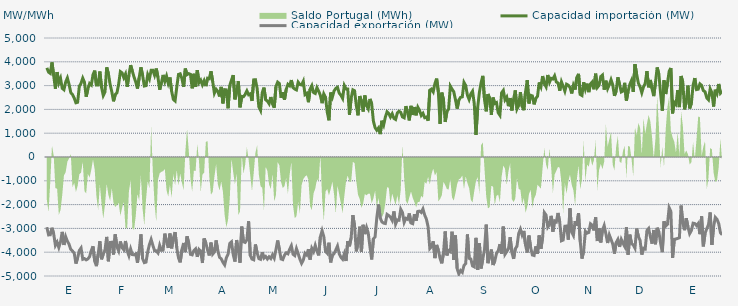
| Category | Capacidad importación (MW) | Capacidad exportación (MW) |
|---|---|---|
| 0 | 3746.25 | -2948.958 |
| 1900-01-01 | 3564.375 | -3273.75 |
| 1900-01-02 | 3513.75 | -3266.25 |
| 1900-01-03 | 3975 | -2973.75 |
| 1900-01-04 | 3418.125 | -3228.75 |
| 1900-01-05 | 2868.75 | -3712.5 |
| 1900-01-06 | 3568.125 | -3577.5 |
| 1900-01-07 | 3120 | -3802.5 |
| 1900-01-08 | 3305.625 | -3564.375 |
| 1900-01-09 | 2884.375 | -3145.875 |
| 1900-01-10 | 2826.25 | -3695.625 |
| 1900-01-11 | 3149.792 | -3346.875 |
| 1900-01-12 | 3321.458 | -3540 |
| 1900-01-13 | 3048.75 | -3665.625 |
| 1900-01-14 | 2704.25 | -3881.25 |
| 1900-01-15 | 2627.25 | -3950.625 |
| 1900-01-16 | 2475.708 | -4038.75 |
| 1900-01-17 | 2277.917 | -4477.5 |
| 1900-01-18 | 2300 | -4239.375 |
| 1900-01-19 | 2972.708 | -3928.125 |
| 1900-01-20 | 3093.75 | -3825 |
| 1900-01-21 | 3313.333 | -4297.5 |
| 1900-01-22 | 3141.75 | -4268.125 |
| 1900-01-23 | 2533.125 | -4321.875 |
| 1900-01-24 | 2863.375 | -4282.5 |
| 1900-01-25 | 3088.125 | -4185 |
| 1900-01-26 | 3024.375 | -3931.875 |
| 1900-01-27 | 3459.375 | -3751.875 |
| 1900-01-28 | 3630 | -4380 |
| 1900-01-29 | 3020.625 | -4586.25 |
| 1900-01-30 | 3020.625 | -4091.25 |
| 1900-01-31 | 3592.5 | -3540 |
| 1900-02-01 | 2925 | -4297.5 |
| 1900-02-02 | 2582.625 | -4080.542 |
| 1900-02-03 | 2730 | -3900.625 |
| 1900-02-04 | 3769.167 | -3357.25 |
| 1900-02-05 | 3498.625 | -4380 |
| 1900-02-06 | 3058.125 | -3591.583 |
| 1900-02-07 | 2735.625 | -3581.875 |
| 1900-02-08 | 2339.792 | -4096.875 |
| 1900-02-09 | 2622.625 | -3250.667 |
| 1900-02-10 | 2697.5 | -3770.625 |
| 1900-02-11 | 3064.167 | -3943.625 |
| 1900-02-12 | 3588.75 | -3549.375 |
| 1900-02-13 | 3535.75 | -3810 |
| 1900-02-14 | 3333.958 | -3898.125 |
| 1900-02-15 | 3486.625 | -3530.542 |
| 1900-02-16 | 2951.375 | -3943.125 |
| 1900-02-17 | 3439.375 | -4149.375 |
| 1900-02-18 | 3860.625 | -3864.375 |
| 1900-02-19 | 3609.583 | -4100.625 |
| 1900-02-20 | 3359.75 | -4110 |
| 1900-02-21 | 3152.25 | -4073.75 |
| 1900-02-22 | 2876.25 | -4441.875 |
| 1900-02-23 | 3331.25 | -3948.75 |
| 1900-02-24 | 3768.75 | -3251.25 |
| 1900-02-25 | 3435.667 | -4269.375 |
| 1900-02-26 | 2984.167 | -4438.125 |
| 1900-02-27 | 2998.583 | -4415.625 |
| 1900-02-28 | 3457.333 | -3980.625 |
| 1900-02-28 | 3283.042 | -3676.875 |
| 1900-03-01 | 3641.25 | -3464.5 |
| 1900-03-02 | 3640.708 | -3708.75 |
| 1900-03-03 | 3435.708 | -3937.5 |
| 1900-03-04 | 3718.125 | -3943.125 |
| 1900-03-05 | 3344.458 | -4031.25 |
| 1900-03-06 | 2827.083 | -3710.625 |
| 1900-03-07 | 3113.75 | -3920.625 |
| 1900-03-08 | 3448.125 | -3913.125 |
| 1900-03-09 | 3172.083 | -3219.375 |
| 1900-03-10 | 3397.5 | -3562.5 |
| 1900-03-11 | 3101.042 | -3819.375 |
| 1900-03-12 | 3341.25 | -3215.625 |
| 1900-03-13 | 2760.833 | -3838.125 |
| 1900-03-14 | 2417.5 | -3395.625 |
| 1900-03-15 | 2354.583 | -3155.625 |
| 1900-03-16 | 2936.875 | -3811.875 |
| 1900-03-17 | 3468.75 | -4241.25 |
| 1900-03-18 | 3495 | -4426.875 |
| 1900-03-19 | 3297.083 | -3890.625 |
| 1900-03-20 | 2946.292 | -3613.125 |
| 1900-03-21 | 3714.792 | -3997.5 |
| 1900-03-22 | 3460.833 | -3331.875 |
| 1900-03-23 | 3502.917 | -3618.5 |
| 1900-03-24 | 3472.5 | -4089.375 |
| 1900-03-25 | 2885.87 | -4111.304 |
| 1900-03-26 | 3496.875 | -3930 |
| 1900-03-27 | 2942.5 | -3858.75 |
| 1900-03-28 | 3650.625 | -4194.375 |
| 1900-03-29 | 3122.458 | -3885 |
| 1900-03-30 | 3230.042 | -3961.875 |
| 1900-03-31 | 3034.208 | -4453.125 |
| 1900-04-01 | 3206.25 | -3423.75 |
| 1900-04-02 | 2977.5 | -3611.25 |
| 1900-04-03 | 3309.375 | -3911.25 |
| 1900-04-04 | 3288.75 | -4138.125 |
| 1900-04-05 | 3602.833 | -3596.25 |
| 1900-04-06 | 3174.375 | -4080 |
| 1900-04-07 | 2683.667 | -3991.875 |
| 1900-04-08 | 2848.875 | -3504.833 |
| 1900-04-09 | 2758.542 | -3938.333 |
| 1900-04-10 | 2545.417 | -4209.375 |
| 1900-04-11 | 2945.625 | -4278.75 |
| 1900-04-12 | 2252.5 | -4423.125 |
| 1900-04-13 | 2829.375 | -4533.75 |
| 1900-04-14 | 2820.917 | -4235.625 |
| 1900-04-15 | 2048.125 | -4081.208 |
| 1900-04-16 | 3003.75 | -3632.292 |
| 1900-04-17 | 3232.5 | -3565.625 |
| 1900-04-18 | 3440.625 | -4096.875 |
| 1900-04-19 | 2422.5 | -4393.125 |
| 1900-04-20 | 2763.958 | -3487.5 |
| 1900-04-21 | 3183.75 | -3943.125 |
| 1900-04-22 | 2087.083 | -4443.75 |
| 1900-04-23 | 2547 | -2925.75 |
| 1900-04-24 | 2531.667 | -3560.625 |
| 1900-04-25 | 2628.75 | -3590.625 |
| 1900-04-26 | 2778.75 | -3480 |
| 1900-04-27 | 2617.292 | -2701.792 |
| 1900-04-28 | 2655 | -4141.875 |
| 1900-04-29 | 2355.417 | -4288.125 |
| 1900-04-30 | 3240.75 | -4318.125 |
| 1900-05-01 | 3247.5 | -3676.875 |
| 1900-05-02 | 2878.042 | -4025.625 |
| 1900-05-03 | 2109.167 | -4269.375 |
| 1900-05-04 | 1961.042 | -4299.375 |
| 1900-05-05 | 2710.208 | -4003.125 |
| 1900-05-06 | 2916 | -4248.333 |
| 1900-05-07 | 2401.875 | -4179.375 |
| 1900-05-08 | 2351.25 | -4286.25 |
| 1900-05-09 | 2238.75 | -4192.5 |
| 1900-05-10 | 2520 | -4265.625 |
| 1900-05-11 | 2227.5 | -4108.125 |
| 1900-05-12 | 2070.583 | -4246.875 |
| 1900-05-13 | 2958.75 | -3892.5 |
| 1900-05-14 | 3146.25 | -3508.125 |
| 1900-05-15 | 3087.5 | -3877.5 |
| 1900-05-16 | 2487.5 | -4284.375 |
| 1900-05-17 | 2722.5 | -4310.625 |
| 1900-05-18 | 2411.25 | -4125 |
| 1900-05-19 | 2840.5 | -4025.625 |
| 1900-05-20 | 3054.5 | -4066.875 |
| 1900-05-21 | 2992.958 | -3879.375 |
| 1900-05-22 | 3232.5 | -3729.375 |
| 1900-05-23 | 2917.5 | -4085.625 |
| 1900-05-24 | 2853.75 | -4141.875 |
| 1900-05-25 | 2819.458 | -3849.375 |
| 1900-05-26 | 3145.042 | -4061.25 |
| 1900-05-27 | 3046.958 | -4290 |
| 1900-05-28 | 3028.125 | -4468.125 |
| 1900-05-29 | 3180.542 | -4331.25 |
| 1900-05-30 | 2624.958 | -4042.5 |
| 1900-05-31 | 2676.25 | -4115.625 |
| 1900-06-01 | 2302.5 | -3873.75 |
| 1900-06-02 | 2854.208 | -4308.75 |
| 1900-06-03 | 2997.833 | -3837.167 |
| 1900-06-04 | 2709.375 | -3973.125 |
| 1900-06-05 | 2670 | -3712.958 |
| 1900-06-06 | 2913.75 | -3958.125 |
| 1900-06-07 | 2765.625 | -4134.375 |
| 1900-06-08 | 2587.5 | -3352.5 |
| 1900-06-09 | 2261.25 | -3093.75 |
| 1900-06-10 | 2651.25 | -3345.208 |
| 1900-06-11 | 2510.625 | -3963.75 |
| 1900-06-12 | 1885.875 | -4044.375 |
| 1900-06-13 | 1541.5 | -3601.375 |
| 1900-06-14 | 2707.5 | -4426.875 |
| 1900-06-15 | 2516.25 | -4128.75 |
| 1900-06-16 | 2775 | -4059.375 |
| 1900-06-17 | 2883.75 | -3906.667 |
| 1900-06-18 | 2930.625 | -3742.5 |
| 1900-06-19 | 2685 | -4061.25 |
| 1900-06-20 | 2596.875 | -4213.125 |
| 1900-06-21 | 2463.75 | -4295.625 |
| 1900-06-22 | 3005.625 | -4065 |
| 1900-06-23 | 2861.25 | -4370.625 |
| 1900-06-24 | 2855.083 | -3533.583 |
| 1900-06-25 | 1775.625 | -3751.875 |
| 1900-06-26 | 2478.75 | -3391.875 |
| 1900-06-27 | 2821.875 | -2444.375 |
| 1900-06-28 | 2782.5 | -2903.75 |
| 1900-06-29 | 2169.375 | -3964.667 |
| 1900-06-30 | 1751.292 | -3614.625 |
| 1900-07-01 | 2561.25 | -2926.875 |
| 1900-07-02 | 2356.875 | -3995.625 |
| 1900-07-03 | 1911.125 | -2849.625 |
| 1900-07-04 | 2583.75 | -3240 |
| 1900-07-05 | 2157.125 | -2962.917 |
| 1900-07-06 | 2021.375 | -3195.625 |
| 1900-07-07 | 2439.375 | -3776.25 |
| 1900-07-08 | 2235 | -4305 |
| 1900-07-09 | 1509.375 | -3436.875 |
| 1900-07-10 | 1230.208 | -3360 |
| 1900-07-11 | 1123.125 | -2546.875 |
| 1900-07-12 | 1221.25 | -1995.875 |
| 1900-07-13 | 962.083 | -2563.125 |
| 1900-07-14 | 1523.958 | -2728.125 |
| 1900-07-15 | 1344.375 | -2776.875 |
| 1900-07-16 | 1676.25 | -2795.625 |
| 1900-07-17 | 1899.375 | -2411.25 |
| 1900-07-18 | 1826.25 | -2461.875 |
| 1900-07-19 | 1680 | -2529.375 |
| 1900-07-20 | 1815 | -2662.5 |
| 1900-07-21 | 1621.458 | -2287.5 |
| 1900-07-22 | 1577.083 | -2818.125 |
| 1900-07-23 | 1846.875 | -2643.75 |
| 1900-07-24 | 1923.75 | -2656.875 |
| 1900-07-25 | 1875 | -2195.625 |
| 1900-07-26 | 1683.75 | -2330.625 |
| 1900-07-27 | 1646.25 | -2746.875 |
| 1900-07-28 | 2137.5 | -2580.5 |
| 1900-07-29 | 1860 | -2620.625 |
| 1900-07-30 | 1537.5 | -2371.875 |
| 1900-07-31 | 2149.292 | -2771.25 |
| 1900-08-01 | 1766.25 | -2801.25 |
| 1900-08-02 | 2097.75 | -2405.625 |
| 1900-08-03 | 1753.125 | -2676.75 |
| 1900-08-04 | 2090.625 | -2285.292 |
| 1900-08-05 | 1956.125 | -2274.75 |
| 1900-08-06 | 1743.75 | -2330.125 |
| 1900-08-07 | 1833.75 | -2185.875 |
| 1900-08-08 | 1651.875 | -2439.375 |
| 1900-08-09 | 1677 | -2608.125 |
| 1900-08-10 | 1526.25 | -2926.875 |
| 1900-08-11 | 2806.875 | -3847.5 |
| 1900-08-12 | 2853.75 | -3770.625 |
| 1900-08-13 | 2739.375 | -3542.5 |
| 1900-08-14 | 3086.25 | -4248.75 |
| 1900-08-15 | 3294.375 | -3694.583 |
| 1900-08-16 | 2737.5 | -3914.167 |
| 1900-08-17 | 1388.958 | -4258.125 |
| 1900-08-18 | 2705.625 | -4468.125 |
| 1900-08-19 | 2414.25 | -4032.292 |
| 1900-08-20 | 1474.5 | -3127.5 |
| 1900-08-21 | 1904.833 | -4134.375 |
| 1900-08-22 | 2018.333 | -3933.75 |
| 1900-08-23 | 2978.625 | -3980.625 |
| 1900-08-24 | 2851.875 | -3137.917 |
| 1900-08-25 | 2745 | -4327.5 |
| 1900-08-26 | 2411.25 | -3294.375 |
| 1900-08-27 | 2032.5 | -4693.125 |
| 1900-08-28 | 2394.375 | -4916.25 |
| 1900-08-29 | 2506.875 | -4770 |
| 1900-08-30 | 2527.5 | -4845 |
| 1900-08-31 | 3132.875 | -4556.25 |
| 1900-09-01 | 3001.875 | -4479.375 |
| 1900-09-02 | 2597 | -3253.75 |
| 1900-09-03 | 2415.833 | -4258.125 |
| 1900-09-04 | 2655 | -4284.375 |
| 1900-09-05 | 2764.458 | -4576.875 |
| 1900-09-06 | 2248.625 | -4616.25 |
| 1900-09-07 | 931.875 | -3396.042 |
| 1900-09-08 | 2074.792 | -4740 |
| 1900-09-09 | 2707.5 | -3624.375 |
| 1900-09-10 | 3118.125 | -4681.875 |
| 1900-09-11 | 3408.75 | -4280.625 |
| 1900-09-12 | 2415 | -3889.583 |
| 1900-09-13 | 1918.917 | -2840.25 |
| 1900-09-14 | 2645.125 | -4460.625 |
| 1900-09-15 | 2469.792 | -4186.875 |
| 1900-09-16 | 1772.542 | -3887.917 |
| 1900-09-17 | 2498.667 | -4538.125 |
| 1900-09-18 | 2245.542 | -4370 |
| 1900-09-19 | 2285.625 | -4056.25 |
| 1900-09-20 | 1862.708 | -3941.667 |
| 1900-09-21 | 1755.417 | -3663.125 |
| 1900-09-22 | 2699.583 | -4063.125 |
| 1900-09-23 | 2797.5 | -2925.625 |
| 1900-09-24 | 2403.333 | -4085.625 |
| 1900-09-25 | 2516.25 | -3971.25 |
| 1900-09-26 | 2135.625 | -3854.792 |
| 1900-09-27 | 2477.125 | -3369.292 |
| 1900-09-28 | 1956.292 | -3999.375 |
| 1900-09-29 | 2427.5 | -4280 |
| 1900-09-30 | 2798 | -3856.875 |
| 1900-10-01 | 2018.125 | -3744.583 |
| 1900-10-02 | 2168.958 | -3208.75 |
| 1900-10-03 | 2728.125 | -3034.375 |
| 1900-10-04 | 2131.75 | -3278.125 |
| 1900-10-05 | 1966.875 | -3106.458 |
| 1900-10-06 | 2738.083 | -3703.375 |
| 1900-10-07 | 3229.167 | -4012.5 |
| 1900-10-08 | 2249.792 | -3300.833 |
| 1900-10-09 | 2592.917 | -3809.792 |
| 1900-10-10 | 2566.25 | -4116.667 |
| 1900-10-11 | 2212.5 | -4138.708 |
| 1900-10-12 | 2464.375 | -3755.833 |
| 1900-10-13 | 2551.042 | -4061.25 |
| 1900-10-14 | 3133.5 | -3295.833 |
| 1900-10-15 | 2953.75 | -3854.167 |
| 1900-10-16 | 3401.25 | -3375.917 |
| 1900-10-17 | 3082.5 | -2336.25 |
| 1900-10-18 | 2949.375 | -2439.375 |
| 1900-10-19 | 3446.25 | -2947.5 |
| 1900-10-20 | 3138.75 | -2840.625 |
| 1900-10-21 | 3305 | -2472.958 |
| 1900-10-22 | 3276.125 | -3134.625 |
| 1900-10-23 | 3410.625 | -2685.417 |
| 1900-10-24 | 3153.75 | -2727.292 |
| 1900-10-25 | 3110.625 | -2351.25 |
| 1900-10-26 | 2786.458 | -2737.5 |
| 1900-10-27 | 3159.375 | -3519.375 |
| 1900-10-28 | 2974.6 | -3488.4 |
| 1900-10-29 | 2766.667 | -2906.917 |
| 1900-10-30 | 3058.125 | -2902.5 |
| 1900-10-31 | 3018.75 | -3474.375 |
| 1900-11-01 | 2925.625 | -2158.375 |
| 1900-11-02 | 2670.667 | -3157.5 |
| 1900-11-03 | 3015 | -3296.25 |
| 1900-11-04 | 2835.25 | -2693.125 |
| 1900-11-05 | 3337.5 | -2882.083 |
| 1900-11-06 | 3493.125 | -2358.75 |
| 1900-11-07 | 2626.042 | -3555 |
| 1900-11-08 | 2583.542 | -4267.5 |
| 1900-11-09 | 3140.625 | -3948.75 |
| 1900-11-10 | 2844.375 | -3122.5 |
| 1900-11-11 | 3082.5 | -3200.625 |
| 1900-11-12 | 2726.25 | -3170.625 |
| 1900-11-13 | 3071.25 | -2806.875 |
| 1900-11-14 | 3151.875 | -2865 |
| 1900-11-15 | 2845.417 | -3084.375 |
| 1900-11-16 | 3500.625 | -2536.875 |
| 1900-11-17 | 2921.75 | -3531.625 |
| 1900-11-18 | 3012.625 | -2985.75 |
| 1900-11-19 | 3378.75 | -3590.625 |
| 1900-11-20 | 3442.5 | -3078.75 |
| 1900-11-21 | 2829.167 | -2881.042 |
| 1900-11-22 | 3205.833 | -3234.375 |
| 1900-11-23 | 2873.625 | -3613.125 |
| 1900-11-24 | 3038.333 | -3270 |
| 1900-11-25 | 3245.625 | -3459.375 |
| 1900-11-26 | 3029.167 | -3656.25 |
| 1900-11-27 | 2571.042 | -4057.5 |
| 1900-11-28 | 2766.125 | -3596.417 |
| 1900-11-29 | 3348.75 | -3465 |
| 1900-11-30 | 3046.333 | -3774.375 |
| 1900-12-01 | 2732.708 | -3460.042 |
| 1900-12-02 | 2770.75 | -3616.875 |
| 1900-12-03 | 3116.25 | -3757.75 |
| 1900-12-04 | 2370.5 | -2949.375 |
| 1900-12-05 | 2758.625 | -4102.5 |
| 1900-12-06 | 3054.167 | -3262.5 |
| 1900-12-07 | 3221.875 | -3637.5 |
| 1900-12-08 | 2734.792 | -3695.625 |
| 1900-12-09 | 3901.875 | -3830.625 |
| 1900-12-10 | 3478.125 | -3007.5 |
| 1900-12-11 | 3100.208 | -3343.125 |
| 1900-12-12 | 2951.458 | -3500.625 |
| 1900-12-13 | 2703.125 | -4100.625 |
| 1900-12-14 | 2949.667 | -3832.5 |
| 1900-12-15 | 3092.292 | -3864.375 |
| 1900-12-16 | 3609.375 | -3088.125 |
| 1900-12-17 | 2928.75 | -3003.75 |
| 1900-12-18 | 3238.333 | -3346.875 |
| 1900-12-19 | 2865.417 | -3639.375 |
| 1900-12-20 | 2557.917 | -3067.5 |
| 1900-12-21 | 3131.667 | -3665.625 |
| 1900-12-22 | 3761.25 | -2973.625 |
| 1900-12-23 | 3468.542 | -3153.75 |
| 1900-12-24 | 2673.75 | -3622.5 |
| 1900-12-25 | 1945.625 | -3999.375 |
| 1900-12-26 | 3222.083 | -2703.875 |
| 1900-12-27 | 2645.458 | -2900.625 |
| 1900-12-28 | 3097.5 | -2827.5 |
| 1900-12-29 | 3595.208 | -2128.75 |
| 1900-12-30 | 3741.458 | -2283.75 |
| 1900-12-31 | 1833.125 | -4242.5 |
| 1901-01-01 | 2294.25 | -3457.125 |
| 1901-01-02 | 2210.833 | -3444.375 |
| 1901-01-03 | 2808.75 | -3420 |
| 1901-01-04 | 2098.083 | -3391.875 |
| 1901-01-05 | 3404.792 | -2041.875 |
| 1901-01-06 | 3136.875 | -2790.292 |
| 1901-01-07 | 2001.25 | -3075.75 |
| 1901-01-08 | 2334.583 | -2570.625 |
| 1901-01-09 | 2998.542 | -2932.5 |
| 1901-01-10 | 2041.583 | -3219.375 |
| 1901-01-11 | 2261.875 | -3091.875 |
| 1901-01-12 | 3017.292 | -2780.625 |
| 1901-01-13 | 3316.667 | -2796 |
| 1901-01-14 | 2831.875 | -2880.375 |
| 1901-01-15 | 2848.875 | -2791.375 |
| 1901-01-16 | 3072.083 | -3242.5 |
| 1901-01-17 | 3008.75 | -2494.125 |
| 1901-01-18 | 2789.75 | -3753.75 |
| 1901-01-19 | 2740.75 | -3208.125 |
| 1901-01-20 | 2484.167 | -3015 |
| 1901-01-21 | 2405.083 | -2845.208 |
| 1901-01-22 | 2862.542 | -2330.625 |
| 1901-01-23 | 2704.875 | -3693.75 |
| 1901-01-24 | 2121.458 | -2932.25 |
| 1901-01-25 | 2826.875 | -2536.458 |
| 1901-01-26 | 2666.25 | -2617.875 |
| 1901-01-27 | 3068.375 | -2797.625 |
| 1901-01-28 | 2681.458 | -3181.875 |
| 1901-01-29 | 2762.167 | -3268.125 |